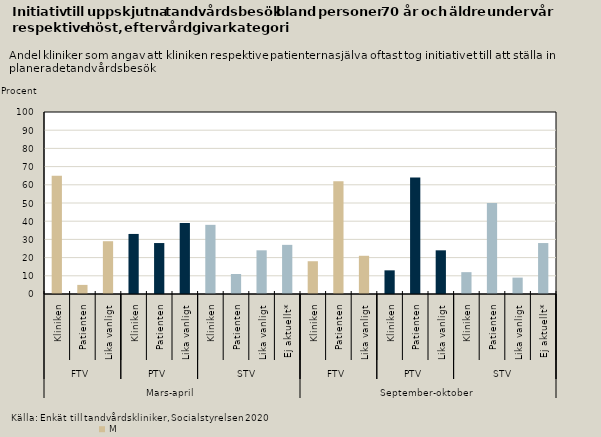
| Category | 70 år och äldre |
|---|---|
| 0 | 65 |
| 1 | 5 |
| 2 | 29 |
| 3 | 33 |
| 4 | 28 |
| 5 | 39 |
| 6 | 38 |
| 7 | 11 |
| 8 | 24 |
| 9 | 27 |
| 10 | 18 |
| 11 | 62 |
| 12 | 21 |
| 13 | 13 |
| 14 | 64 |
| 15 | 24 |
| 16 | 12 |
| 17 | 50 |
| 18 | 9 |
| 19 | 28 |